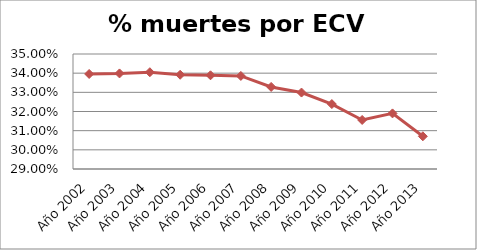
| Category | Series 0 |
|---|---|
| Año 2002 | 0.34 |
| Año 2003 | 0.34 |
| Año 2004 | 0.34 |
| Año 2005 | 0.339 |
| Año 2006 | 0.339 |
| Año 2007 | 0.339 |
| Año 2008 | 0.333 |
| Año 2009 | 0.33 |
| Año 2010 | 0.324 |
| Año 2011 | 0.316 |
| Año 2012 | 0.319 |
| Año 2013 | 0.307 |